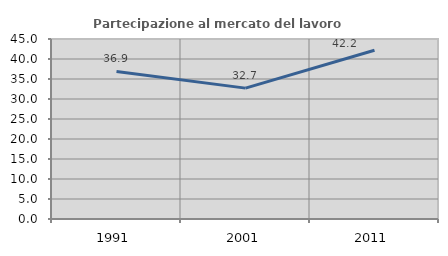
| Category | Partecipazione al mercato del lavoro  femminile |
|---|---|
| 1991.0 | 36.901 |
| 2001.0 | 32.721 |
| 2011.0 | 42.195 |